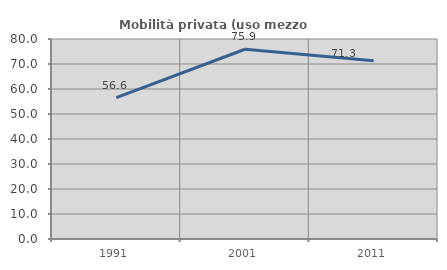
| Category | Mobilità privata (uso mezzo privato) |
|---|---|
| 1991.0 | 56.563 |
| 2001.0 | 75.904 |
| 2011.0 | 71.322 |